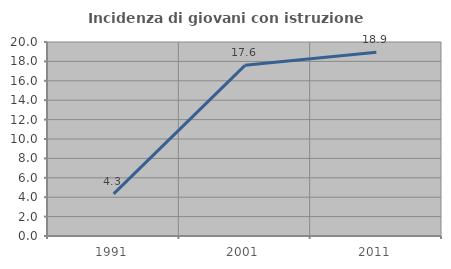
| Category | Incidenza di giovani con istruzione universitaria |
|---|---|
| 1991.0 | 4.348 |
| 2001.0 | 17.593 |
| 2011.0 | 18.947 |